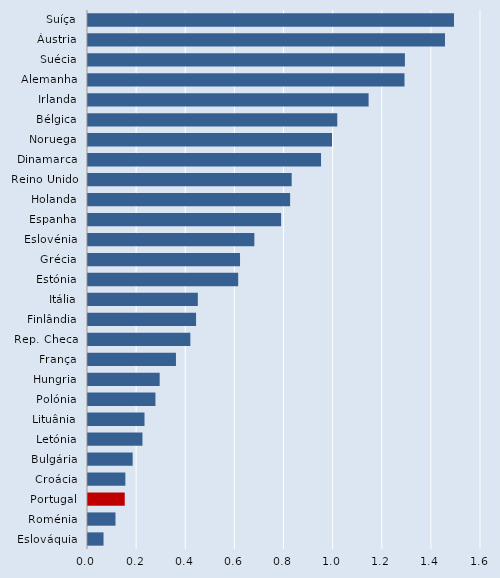
| Category | Series 0 |
|---|---|
| Suíça | 1.49 |
| Áustria | 1.453 |
| Suécia | 1.29 |
| Alemanha | 1.289 |
| Irlanda | 1.142 |
| Bélgica | 1.015 |
| Noruega | 0.993 |
| Dinamarca | 0.949 |
| Reino Unido | 0.829 |
| Holanda | 0.823 |
| Espanha | 0.786 |
| Eslovénia | 0.677 |
| Grécia | 0.619 |
| Estónia | 0.611 |
| Itália | 0.447 |
| Finlândia | 0.44 |
| Rep. Checa | 0.417 |
| França | 0.358 |
| Hungria | 0.292 |
| Polónia | 0.275 |
| Lituânia | 0.23 |
| Letónia | 0.222 |
| Bulgária | 0.182 |
| Croácia | 0.152 |
| Portugal | 0.15 |
| Roménia | 0.112 |
| Eslováquia | 0.063 |